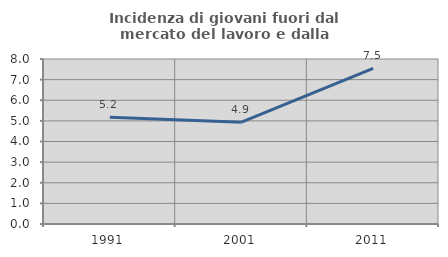
| Category | Incidenza di giovani fuori dal mercato del lavoro e dalla formazione  |
|---|---|
| 1991.0 | 5.179 |
| 2001.0 | 4.938 |
| 2011.0 | 7.547 |